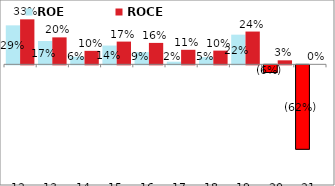
| Category | ROE | ROCE |
|---|---|---|
| 2012-03-31 | 0.287 | 0.331 |
| 2013-03-31 | 0.172 | 0.198 |
| 2014-03-31 | 0.056 | 0.099 |
| 2015-03-31 | 0.138 | 0.167 |
| 2016-03-31 | 0.09 | 0.158 |
| 2017-03-31 | 0.02 | 0.107 |
| 2018-03-31 | 0.053 | 0.101 |
| 2019-03-31 | 0.218 | 0.241 |
| 2020-03-31 | -0.057 | 0.029 |
| 2021-03-31 | -0.622 | 0 |